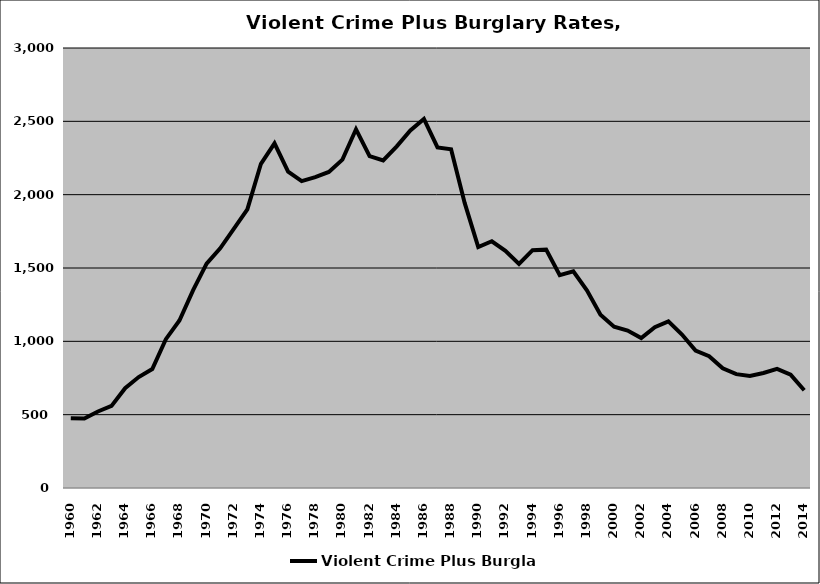
| Category | Violent Crime Plus Burglary |
|---|---|
| 1960.0 | 475.324 |
| 1961.0 | 473.485 |
| 1962.0 | 521.942 |
| 1963.0 | 559.474 |
| 1964.0 | 680.706 |
| 1965.0 | 756.661 |
| 1966.0 | 811.458 |
| 1967.0 | 1014.857 |
| 1968.0 | 1142.082 |
| 1969.0 | 1347.441 |
| 1970.0 | 1530.326 |
| 1971.0 | 1634.291 |
| 1972.0 | 1766.407 |
| 1973.0 | 1900.404 |
| 1974.0 | 2210.591 |
| 1975.0 | 2350.175 |
| 1976.0 | 2157.192 |
| 1977.0 | 2092.172 |
| 1978.0 | 2119.517 |
| 1979.0 | 2155.243 |
| 1980.0 | 2238.786 |
| 1981.0 | 2445.712 |
| 1982.0 | 2262.703 |
| 1983.0 | 2233.584 |
| 1984.0 | 2329.394 |
| 1985.0 | 2437.551 |
| 1986.0 | 2516.383 |
| 1987.0 | 2322.283 |
| 1988.0 | 2309.887 |
| 1989.0 | 1944.043 |
| 1990.0 | 1642.249 |
| 1991.0 | 1682.341 |
| 1992.0 | 1616.863 |
| 1993.0 | 1527.902 |
| 1994.0 | 1621.419 |
| 1995.0 | 1625.215 |
| 1996.0 | 1451.342 |
| 1997.0 | 1477.613 |
| 1998.0 | 1347.349 |
| 1999.0 | 1181.519 |
| 2000.0 | 1099.492 |
| 2001.0 | 1073.805 |
| 2002.0 | 1022.454 |
| 2003.0 | 1096.083 |
| 2004.0 | 1135.948 |
| 2005.0 | 1046.066 |
| 2006.0 | 936.835 |
| 2007.0 | 898.637 |
| 2008.0 | 816.708 |
| 2009.0 | 776.52 |
| 2010.0 | 764.59 |
| 2011.0 | 784.519 |
| 2012.0 | 812.58 |
| 2013.0 | 772.492 |
| 2014.0 | 666.307 |